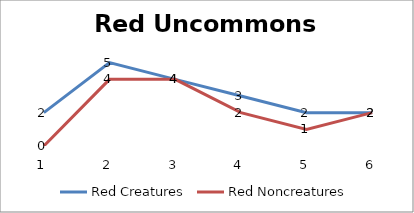
| Category | Red Creatures | Red Noncreatures |
|---|---|---|
| 0 | 2 | 0 |
| 1 | 5 | 4 |
| 2 | 4 | 4 |
| 3 | 3 | 2 |
| 4 | 2 | 1 |
| 5 | 2 | 2 |